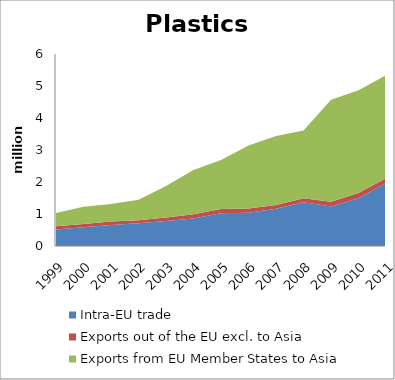
| Category | Intra-EU trade | Exports out of the EU excl. to Asia | Exports from EU Member States to Asia |
|---|---|---|---|
| 1999.0 | 0.512 | 0.104 | 0.416 |
| 2000.0 | 0.584 | 0.103 | 0.544 |
| 2001.0 | 0.655 | 0.114 | 0.545 |
| 2002.0 | 0.707 | 0.101 | 0.636 |
| 2003.0 | 0.778 | 0.109 | 0.986 |
| 2004.0 | 0.857 | 0.133 | 1.386 |
| 2005.0 | 1.02 | 0.134 | 1.535 |
| 2006.0 | 1.039 | 0.134 | 1.969 |
| 2007.0 | 1.166 | 0.112 | 2.162 |
| 2008.0 | 1.366 | 0.126 | 2.114 |
| 2009.0 | 1.233 | 0.147 | 3.193 |
| 2010.0 | 1.489 | 0.169 | 3.206 |
| 2011.0 | 1.97 | 0.147 | 3.216 |